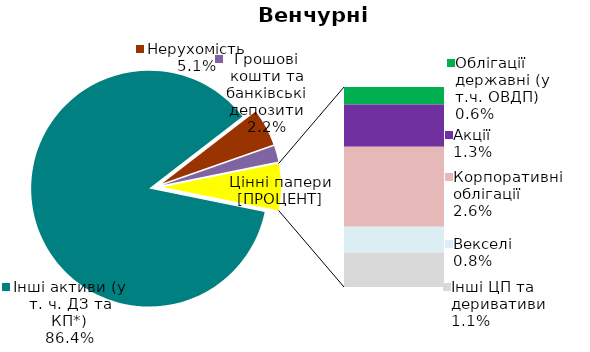
| Category | Series 0 |
|---|---|
| Інші активи (у т. ч. ДЗ та КП*) | 0.864 |
| Нерухомість | 0.051 |
| Грошові кошти та банківські депозити | 0.022 |
| Банківські метали | 0 |
| Облігації державні (у т.ч. ОВДП) | 0.006 |
| Облігації місцевих позик | 0 |
| Акції | 0.013 |
| Корпоративні облігації | 0.026 |
| Векселі | 0.008 |
| Інші ЦП та деривативи | 0.011 |